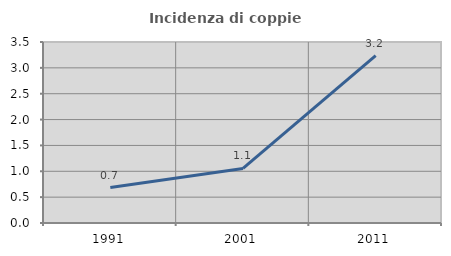
| Category | Incidenza di coppie miste |
|---|---|
| 1991.0 | 0.685 |
| 2001.0 | 1.054 |
| 2011.0 | 3.238 |